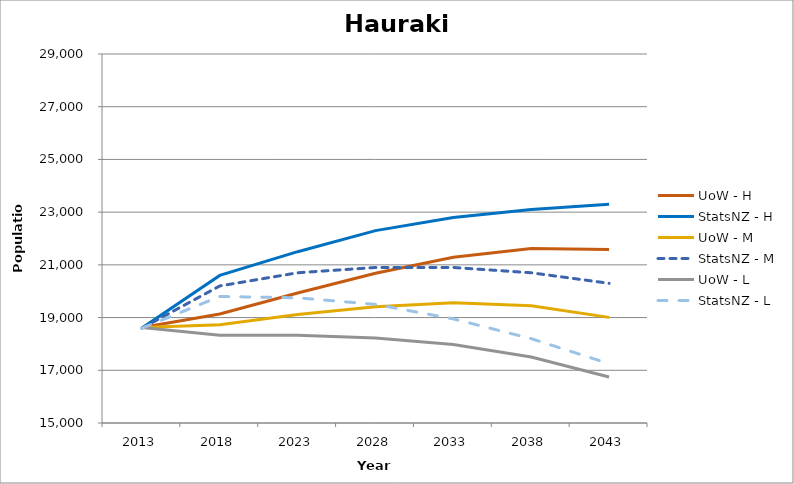
| Category | UoW - H | StatsNZ - H | UoW - M | StatsNZ - M | UoW - L | StatsNZ - L |
|---|---|---|---|---|---|---|
| 2013.0 | 18620 | 18600 | 18620 | 18600 | 18620 | 18600 |
| 2018.0 | 19133.379 | 20600 | 18725.347 | 20200 | 18327.137 | 19800 |
| 2023.0 | 19933.848 | 21500 | 19112.509 | 20700 | 18328.322 | 19750 |
| 2028.0 | 20683.91 | 22300 | 19412.928 | 20900 | 18223.65 | 19500 |
| 2033.0 | 21290.77 | 22800 | 19562.338 | 20900 | 17978.373 | 18950 |
| 2038.0 | 21618.113 | 23100 | 19451.241 | 20700 | 17506.723 | 18200 |
| 2043.0 | 21581.232 | 23300 | 19007.258 | 20300 | 16746.773 | 17250 |